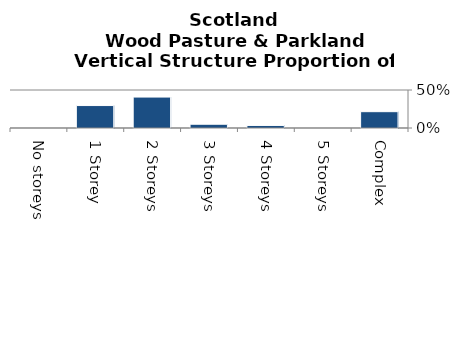
| Category | Wood Pasture & Parkland |
|---|---|
| No storeys | 0 |
| 1 Storey | 0.295 |
| 2 Storeys | 0.407 |
| 3 Storeys | 0.05 |
| 4 Storeys | 0.034 |
| 5 Storeys | 0 |
| Complex | 0.215 |